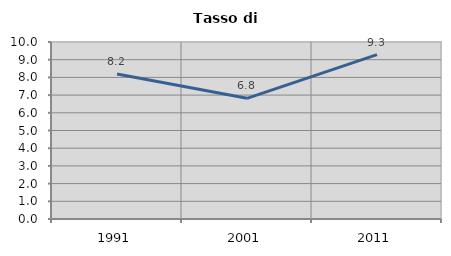
| Category | Tasso di disoccupazione   |
|---|---|
| 1991.0 | 8.197 |
| 2001.0 | 6.818 |
| 2011.0 | 9.29 |